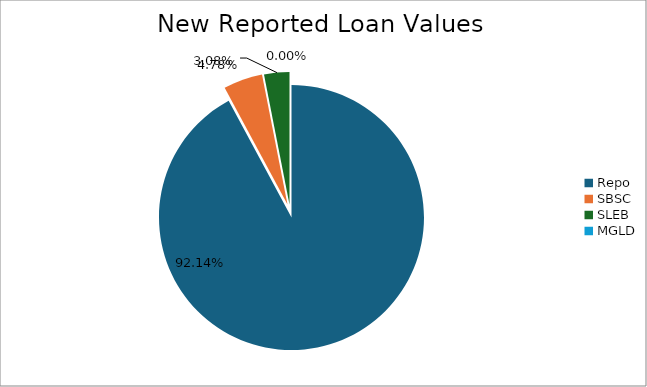
| Category | Series 0 |
|---|---|
| Repo | 11371082.404 |
| SBSC | 590099.707 |
| SLEB | 380337.999 |
| MGLD | 201.184 |